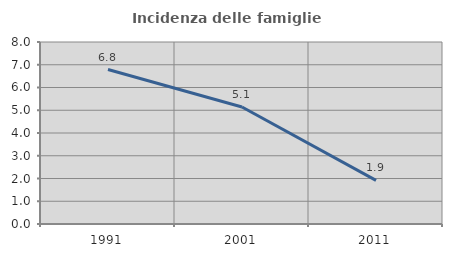
| Category | Incidenza delle famiglie numerose |
|---|---|
| 1991.0 | 6.789 |
| 2001.0 | 5.143 |
| 2011.0 | 1.918 |